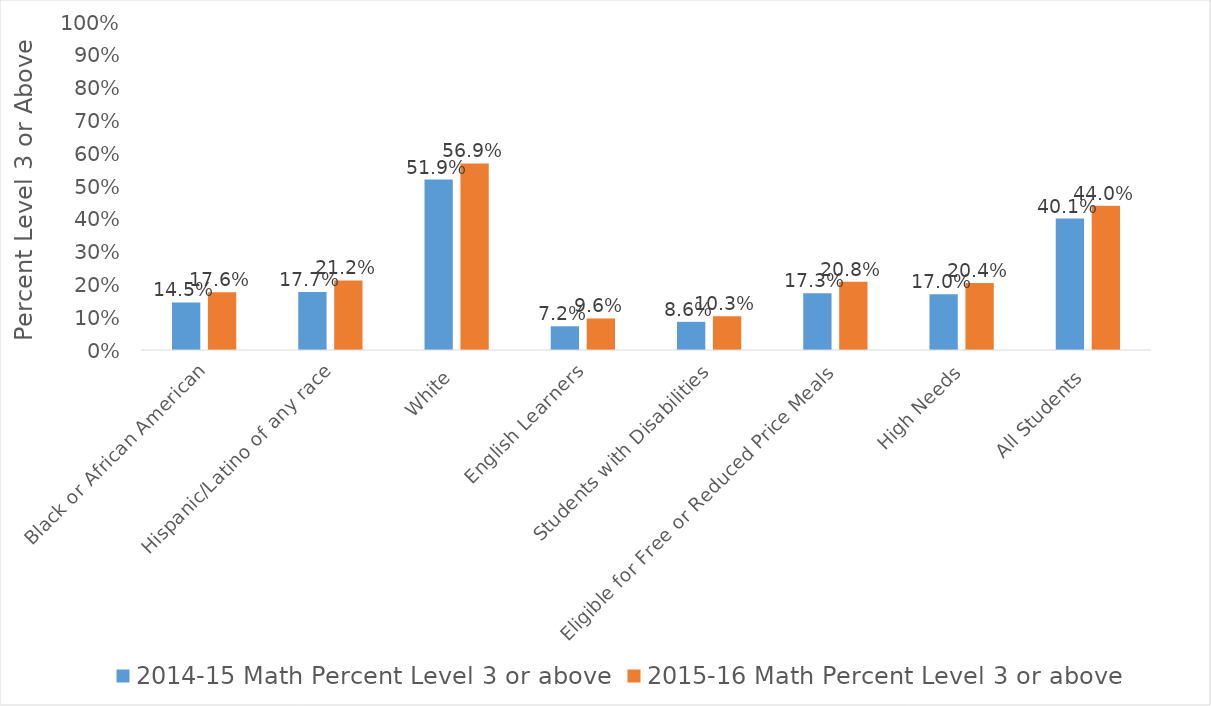
| Category | 2014-15 Math Percent Level 3 or above | 2015-16 Math Percent Level 3 or above |
|---|---|---|
| Black or African American | 0.145 | 0.176 |
| Hispanic/Latino of any race | 0.177 | 0.212 |
| White | 0.519 | 0.569 |
| English Learners | 0.072 | 0.096 |
| Students with Disabilities | 0.086 | 0.103 |
| Eligible for Free or Reduced Price Meals | 0.173 | 0.208 |
| High Needs | 0.17 | 0.204 |
| All Students | 0.401 | 0.44 |